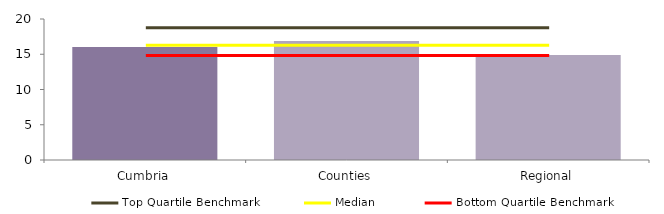
| Category | Block Data |
|---|---|
| Cumbria | 16.018 |
| Counties | 16.892 |
| Regional | 14.888 |